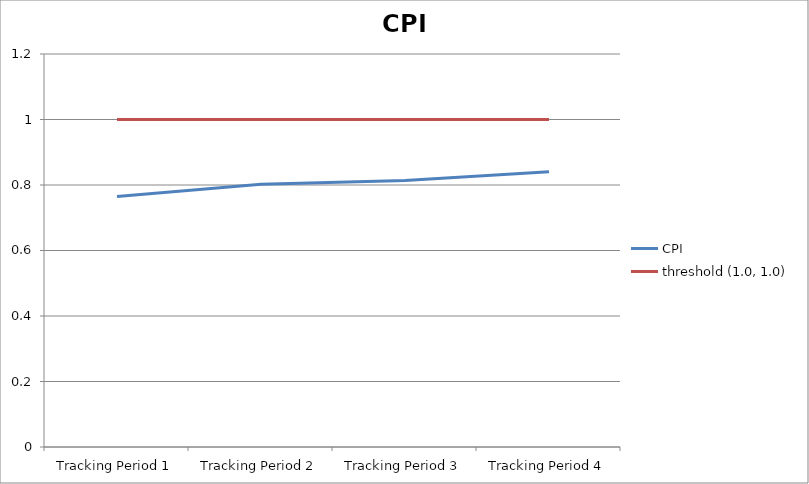
| Category | CPI | threshold (1.0, 1.0) |
|---|---|---|
| Tracking Period 1 | 0.765 | 1 |
| Tracking Period 2 | 0.802 | 1 |
| Tracking Period 3 | 0.814 | 1 |
| Tracking Period 4 | 0.84 | 1 |